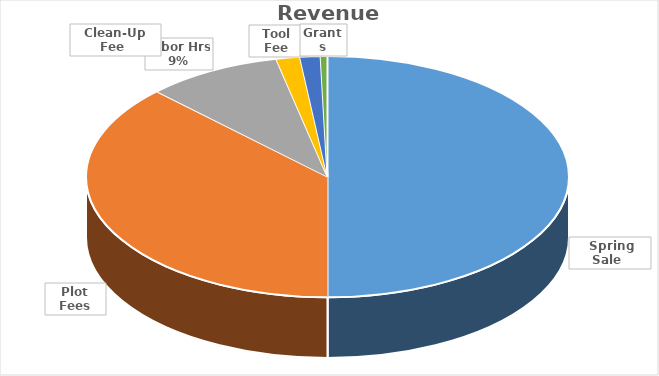
| Category | Series 0 |
|---|---|
|  Spring Sale  | 0.499 |
| Plot Fees | 0.374 |
| Labor Hrs  | 0.091 |
| Tool Fee | 0.016 |
| Clean-Up Fee  | 0.014 |
| Grants | 0.005 |